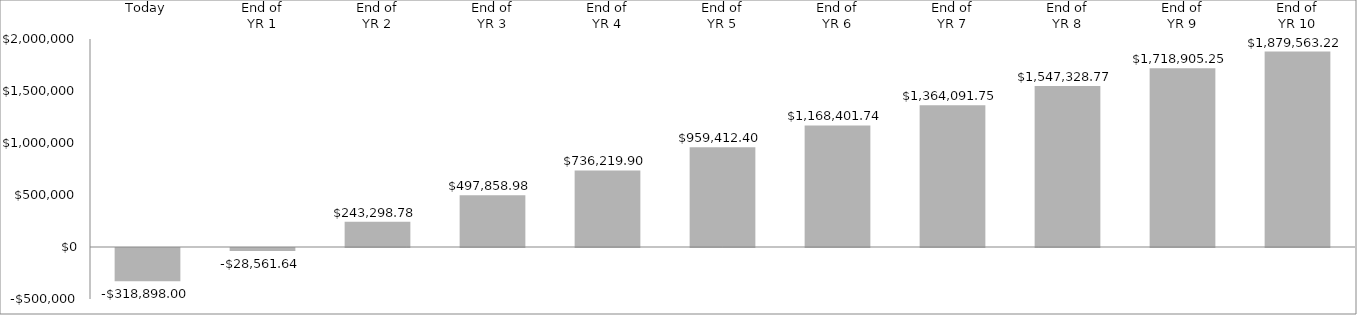
| Category |  $(318,898.00)  $290,336.36   $271,860.41   $254,560.21   $238,360.92   $223,192.50   $208,989.34   $195,690.02   $183,237.02   $171,576.48   $160,657.98  |
|---|---|
| Today | -318898 |
| End of_x000d_YR 1 | -28561.636 |
| End of_x000d_YR 2 | 243298.777 |
| End of_x000d_YR 3 | 497858.982 |
| End of_x000d_YR 4 | 736219.901 |
| End of_x000d_YR 5 | 959412.398 |
| End of_x000d_YR 6 | 1168401.737 |
| End of_x000d_YR 7 | 1364091.754 |
| End of_x000d_YR 8 | 1547328.769 |
| End of_x000d_YR 9 | 1718905.248 |
| End of_x000d_YR 10 | 1879563.223 |